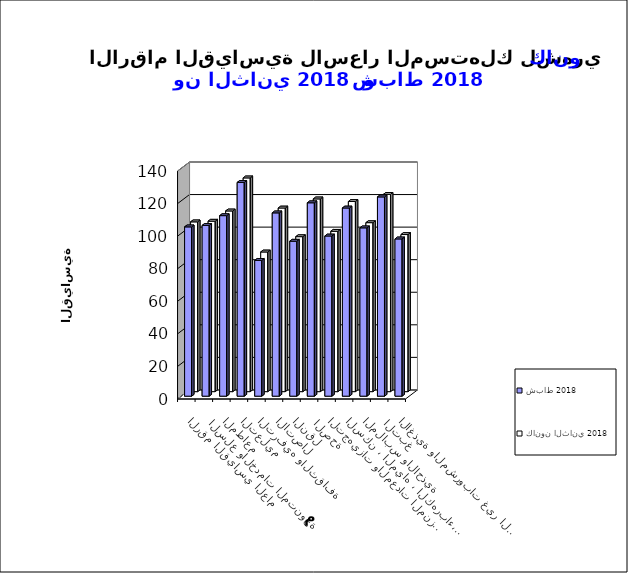
| Category | شباط 2018      | كانون الثاني 2018       |
|---|---|---|
| الاغذية والمشروبات غير الكحولية | 96.6 | 96.5 |
|  التبغ | 122.4 | 121.2 |
| الملابس والاحذية | 103.4 | 103.8 |
| السكن ، المياه ، الكهرباء، الغاز  | 115.6 | 116.8 |
| التجهيزات والمعدات المنزلية والصيانة | 98.4 | 98.5 |
|  الصحة | 118.8 | 118.4 |
| النقل | 95.2 | 95.2 |
| الاتصال | 112.6 | 112.8 |
| الترفيه والثقافة | 83.4 | 85.8 |
| التعليم | 131.3 | 131.3 |
| المطاعم  | 110.9 | 111 |
|  السلع والخدمات المتنوعة | 104.9 | 104.7 |
| الرقم القياسي العام | 104 | 104.3 |